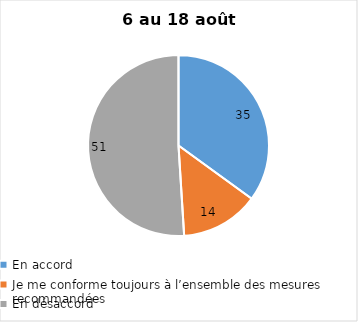
| Category | Series 0 |
|---|---|
| En accord | 35 |
| Je me conforme toujours à l’ensemble des mesures recommandées | 14 |
| En désaccord | 51 |